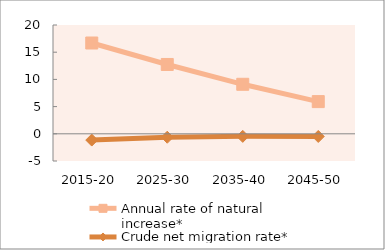
| Category | Annual rate of natural increase* | Crude net migration rate* |
|---|---|---|
| 2015-20 | 16.69 | -1.152 |
| 2025-30 | 12.743 | -0.633 |
| 2035-40 | 9.1 | -0.473 |
| 2045-50 | 5.919 | -0.491 |